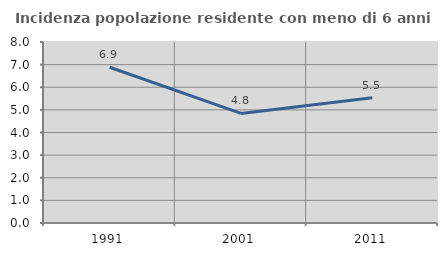
| Category | Incidenza popolazione residente con meno di 6 anni |
|---|---|
| 1991.0 | 6.883 |
| 2001.0 | 4.844 |
| 2011.0 | 5.531 |